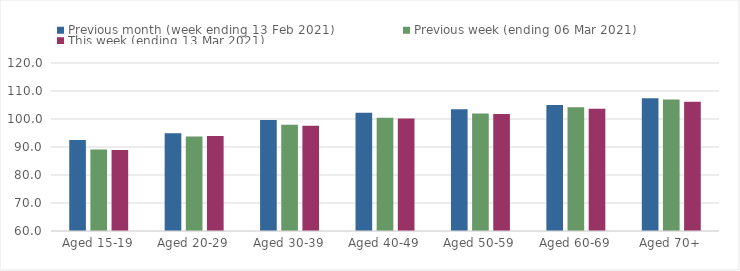
| Category | Previous month (week ending 13 Feb 2021) | Previous week (ending 06 Mar 2021) | This week (ending 13 Mar 2021) |
|---|---|---|---|
| Aged 15-19 | 92.51 | 89.07 | 88.89 |
| Aged 20-29 | 94.94 | 93.78 | 93.96 |
| Aged 30-39 | 99.66 | 97.96 | 97.59 |
| Aged 40-49 | 102.22 | 100.46 | 100.17 |
| Aged 50-59 | 103.47 | 101.94 | 101.78 |
| Aged 60-69 | 105.01 | 104.16 | 103.68 |
| Aged 70+ | 107.43 | 107 | 106.16 |